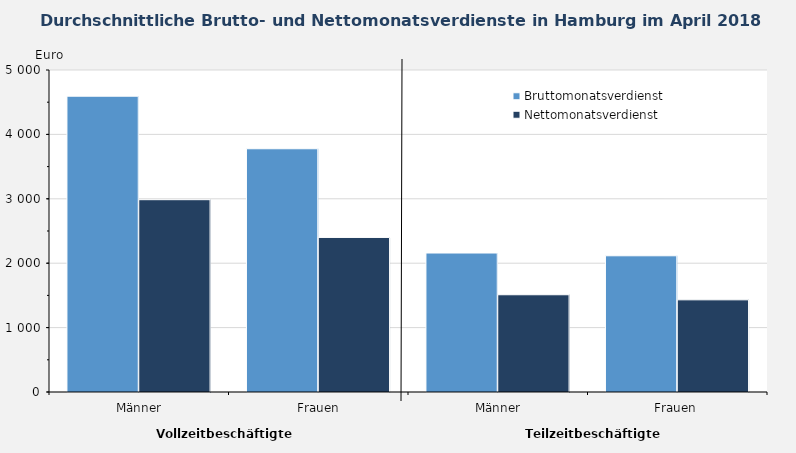
| Category | Bruttomonatsverdienst | Nettomonatsverdienst |
|---|---|---|
|  Männer | 4593 | 2986 |
|  Frauen | 3777 | 2400 |
|  Männer | 2158 | 1510 |
| Frauen | 2115 | 1431 |